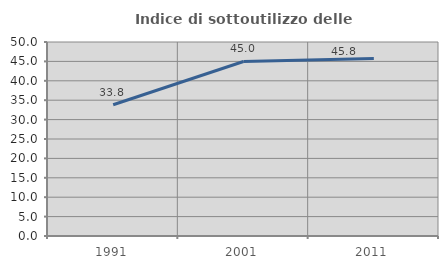
| Category | Indice di sottoutilizzo delle abitazioni  |
|---|---|
| 1991.0 | 33.835 |
| 2001.0 | 44.979 |
| 2011.0 | 45.772 |